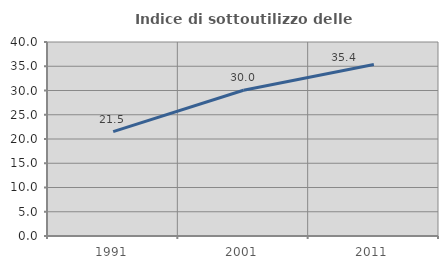
| Category | Indice di sottoutilizzo delle abitazioni  |
|---|---|
| 1991.0 | 21.516 |
| 2001.0 | 30.047 |
| 2011.0 | 35.375 |